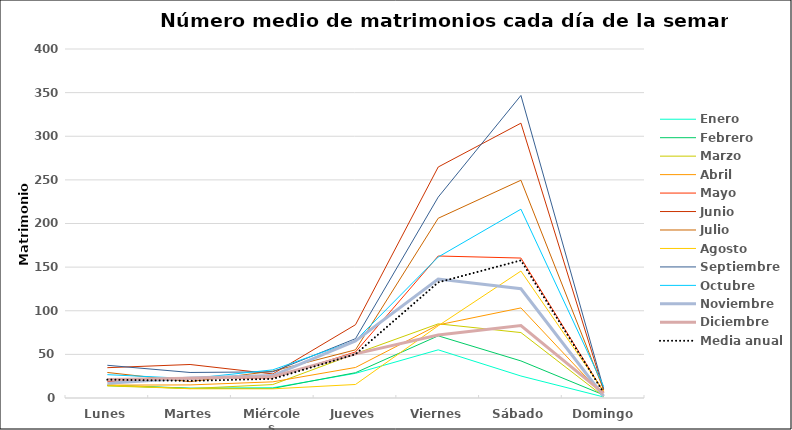
| Category | Enero | Febrero | Marzo | Abril | Mayo | Junio | Julio | Agosto | Septiembre | Octubre | Noviembre | Diciembre | Media anual |
|---|---|---|---|---|---|---|---|---|---|---|---|---|---|
| Lunes | 14.25 | 14.75 | 13.8 | 14.75 | 18.8 | 34.75 | 29.25 | 14.8 | 37.5 | 26.75 | 16.8 | 21.25 | 21.038 |
| Martes | 11 | 11.25 | 10.8 | 15 | 22 | 38.4 | 18.75 | 10.6 | 29.25 | 22.25 | 22.8 | 22.5 | 19.635 |
| Miércoles | 11.75 | 11 | 15.4 | 18.5 | 23 | 27.6 | 30.75 | 10.5 | 30 | 32.25 | 25.75 | 24.4 | 21.942 |
| Jueves | 28.25 | 29 | 50.75 | 35 | 52.75 | 84 | 55.2 | 15.5 | 68 | 65.75 | 65.5 | 50.6 | 50.192 |
| Viernes | 55.2 | 71.25 | 85 | 83.8 | 162.75 | 264.75 | 206 | 82.75 | 230.25 | 161.6 | 136.25 | 72.2 | 132.566 |
| Sábado | 25.2 | 42.5 | 75 | 103.25 | 160.4 | 315 | 249.6 | 145.5 | 346.75 | 216.4 | 125.25 | 83 | 157.75 |
| Domingo | 1.2 | 3.5 | 1.75 | 2.5 | 6.8 | 9 | 9.5 | 7.8 | 10.5 | 13.2 | 2 | 5.25 | 6.173 |